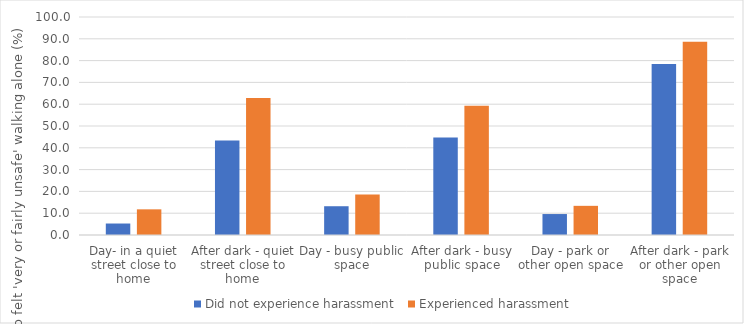
| Category | Did not experience harassment  | Experienced harassment |
|---|---|---|
| Day- in a quiet street close to home | 5.265 | 11.771 |
| After dark - quiet street close to home | 43.315 | 62.883 |
| Day - busy public space | 13.199 | 18.589 |
| After dark - busy public space | 44.714 | 59.299 |
| Day - park or other open space | 9.614 | 13.378 |
| After dark - park or other open space | 78.453 | 88.703 |